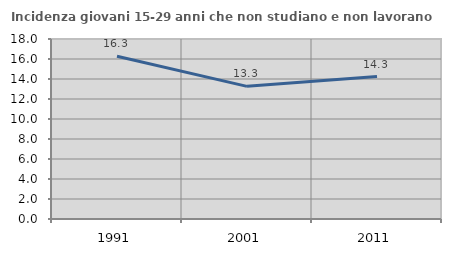
| Category | Incidenza giovani 15-29 anni che non studiano e non lavorano  |
|---|---|
| 1991.0 | 16.278 |
| 2001.0 | 13.265 |
| 2011.0 | 14.25 |